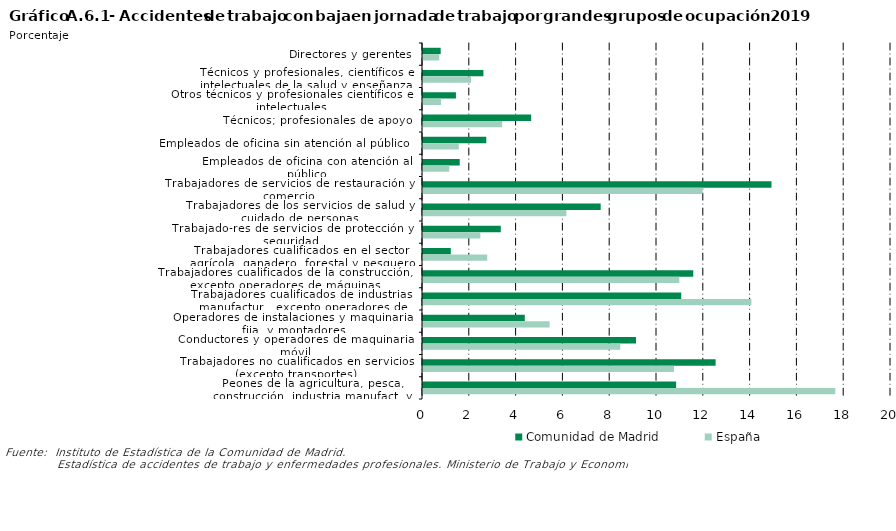
| Category | Comunidad de Madrid | España |
|---|---|---|
| Directores y gerentes | 0.756 | 0.695 |
| Técnicos y profesionales, científicos e intelectuales de la salud y enseñanza | 2.581 | 2.055 |
| Otros técnicos y profesionales científicos e intelectuales | 1.408 | 0.773 |
| Técnicos; profesionales de apoyo | 4.623 | 3.382 |
| Empleados de oficina sin atención al público | 2.705 | 1.529 |
| Empleados de oficina con atención al público | 1.569 | 1.122 |
| Trabajadores de servicios de restauración y comercio | 14.892 | 11.944 |
| Trabajadores de los servicios de salud y cuidado de personas | 7.593 | 6.127 |
| Trabajado-res de servicios de protección y seguridad  | 3.324 | 2.451 |
| Trabajadores cualificados en el sector agrícola, ganadero, forestal y pesquero | 1.188 | 2.744 |
| Trabajadores cualificados de la construcción, excepto operadores de máquinas | 11.55 | 10.954 |
| Trabajadores cualificados de industrias manufactur., excepto operadores de instalaciones y máquinas | 11.036 | 14.034 |
| Operadores de instalaciones y maquinaria fija, y montadores | 4.35 | 5.41 |
| Conductores y operadores de maquinaria móvil | 9.103 | 8.431 |
| Trabajadores no cualificados en servicios (excepto transportes) | 12.505 | 10.729 |
| Peones de la agricultura, pesca, construcción, industria manufact. y transporte | 10.817 | 17.621 |